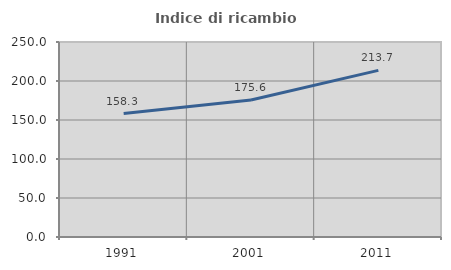
| Category | Indice di ricambio occupazionale  |
|---|---|
| 1991.0 | 158.282 |
| 2001.0 | 175.61 |
| 2011.0 | 213.669 |